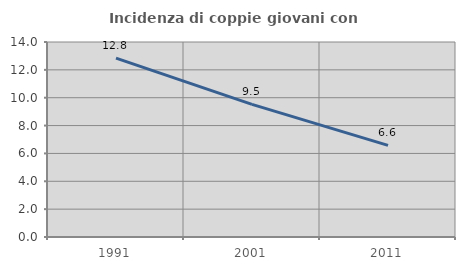
| Category | Incidenza di coppie giovani con figli |
|---|---|
| 1991.0 | 12.844 |
| 2001.0 | 9.524 |
| 2011.0 | 6.579 |